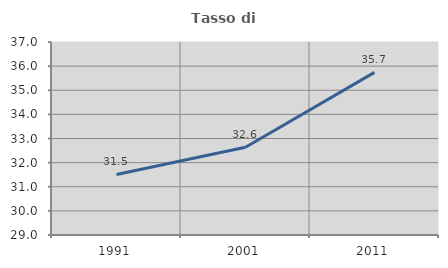
| Category | Tasso di occupazione   |
|---|---|
| 1991.0 | 31.51 |
| 2001.0 | 32.635 |
| 2011.0 | 35.74 |